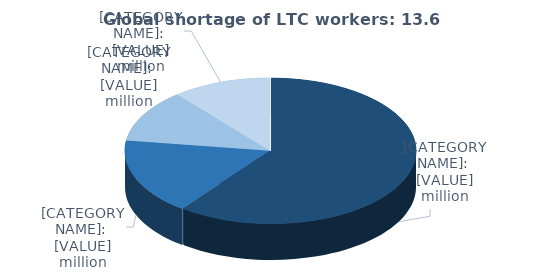
| Category | Global shortage of LTC workers: 13.6 million |
|---|---|
| Asia and the Pacific | 8.2 |
| Europe | 2.3 |
| Americas  | 1.6 |
| Africa | 1.5 |